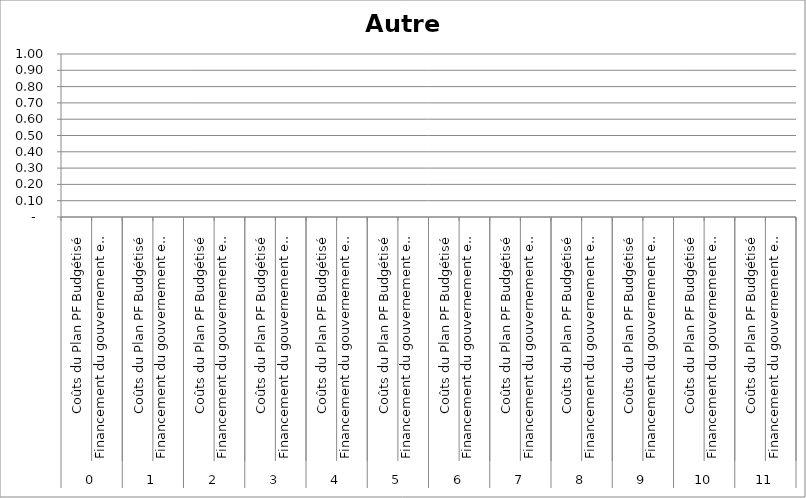
| Category | Autre 4 |
|---|---|
| 0 | 0 |
| 1 | 0 |
| 2 | 0 |
| 3 | 0 |
| 4 | 0 |
| 5 | 0 |
| 6 | 0 |
| 7 | 0 |
| 8 | 0 |
| 9 | 0 |
| 10 | 0 |
| 11 | 0 |
| 12 | 0 |
| 13 | 0 |
| 14 | 0 |
| 15 | 0 |
| 16 | 0 |
| 17 | 0 |
| 18 | 0 |
| 19 | 0 |
| 20 | 0 |
| 21 | 0 |
| 22 | 0 |
| 23 | 0 |